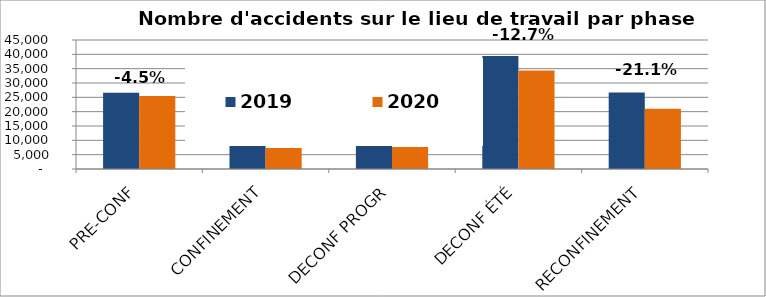
| Category | 2019 | 2020 |
|---|---|---|
| PRE-CONF | 26632 | 25442 |
| CONFINEMENT | 16019 | 7287 |
| DECONF PROGR | 11505 | 7683 |
| DECONF ÉTÉ | 39380 | 34393 |
| RECONFINEMENT | 26666 | 21044 |